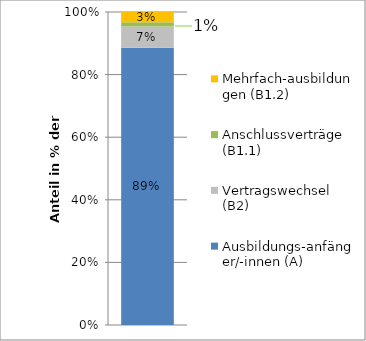
| Category | Ausbildungs-anfänger/-innen (A) | Vertragswechsel (B2) | Anschlussverträge (B1.1) | Mehrfach-ausbildungen (B1.2) |
|---|---|---|---|---|
| 0 | 0.886 | 0.068 | 0.013 | 0.033 |